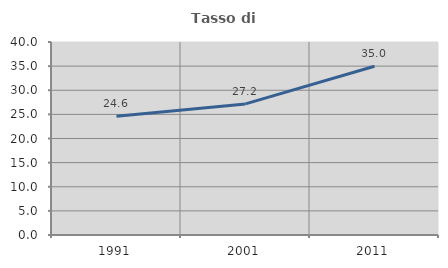
| Category | Tasso di occupazione   |
|---|---|
| 1991.0 | 24.604 |
| 2001.0 | 27.168 |
| 2011.0 | 34.962 |